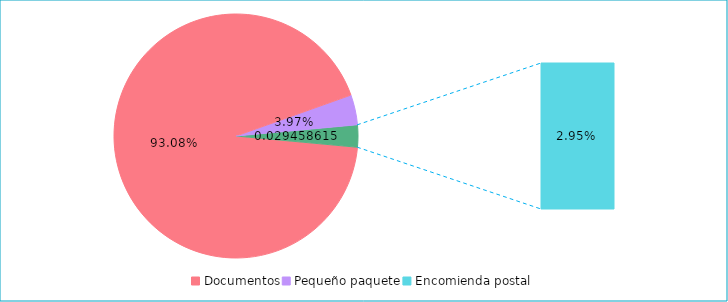
| Category | Series 0 |
|---|---|
| Documentos | 0.931 |
| Pequeño paquete | 0.04 |
| Encomienda postal | 0.029 |